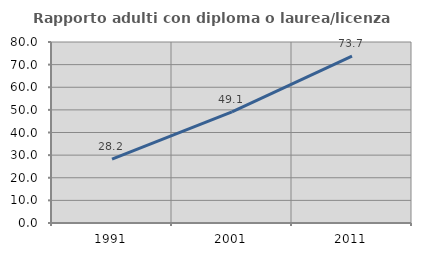
| Category | Rapporto adulti con diploma o laurea/licenza media  |
|---|---|
| 1991.0 | 28.228 |
| 2001.0 | 49.123 |
| 2011.0 | 73.729 |